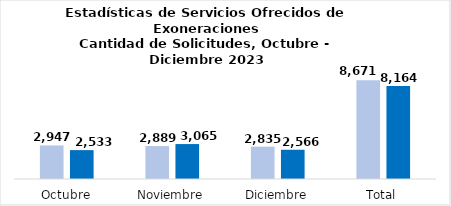
| Category | Tramitadas |
|---|---|
| Octubre | 2533 |
| Noviembre | 3065 |
| Diciembre | 2566 |
| Total | 8164 |